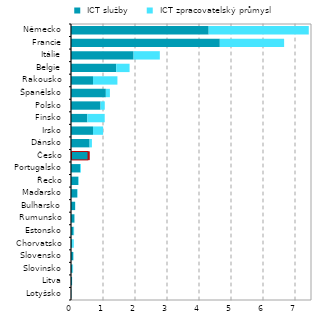
| Category |  ICT služby |  ICT zpracovatelský průmysl |
|---|---|---|
| Lotyšsko | 0.011 | 0.002 |
| Litva | 0.033 | 0.003 |
| Slovinsko | 0.045 | 0.02 |
| Slovensko | 0.072 | 0.003 |
| Chorvatsko | 0.034 | 0.054 |
| Estonsko | 0.082 | 0.015 |
| Rumunsko | 0.107 | 0.002 |
| Bulharsko | 0.128 | 0.006 |
| Maďarsko | 0.193 | 0.014 |
| Řecko | 0.228 | 0.013 |
| Portugalsko | 0.286 | 0.026 |
| Česko | 0.534 | 0.035 |
| Dánsko | 0.581 | 0.073 |
| Irsko | 0.687 | 0.317 |
| Finsko | 0.511 | 0.543 |
| Polsko | 0.923 | 0.132 |
| Španělsko | 1.089 | 0.127 |
| Rakousko | 0.687 | 0.763 |
| Belgie | 1.412 | 0.418 |
| Itálie | 1.956 | 0.82 |
| Francie | 4.65 | 2.01 |
| Německo | 4.302 | 3.128 |